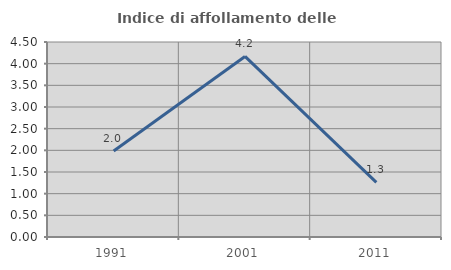
| Category | Indice di affollamento delle abitazioni  |
|---|---|
| 1991.0 | 1.987 |
| 2001.0 | 4.167 |
| 2011.0 | 1.261 |